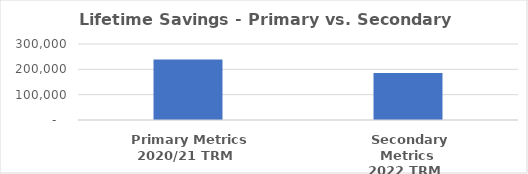
| Category | Series 0 |
|---|---|
|  Primary Metrics
2020/21 TRM  | 238403.548 |
|  Secondary Metrics
2022 TRM  | 185654.795 |